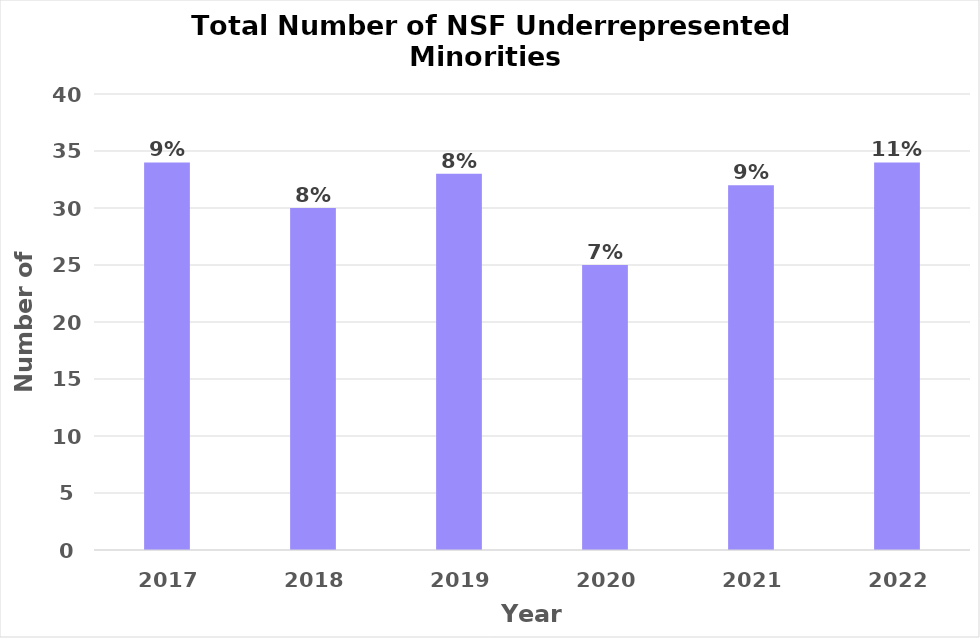
| Category | NSF Underrepresented Students |
|---|---|
| 2017.0 | 34 |
| 2018.0 | 30 |
| 2019.0 | 33 |
| 2020.0 | 25 |
| 2021.0 | 32 |
| 2022.0 | 34 |